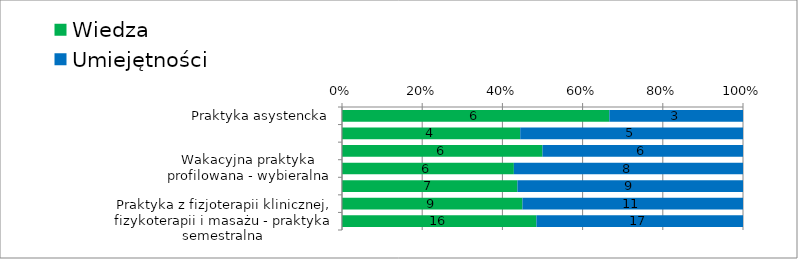
| Category | Wiedza | Umiejętności |
|---|---|---|
| Praktyka asystencka | 6 | 3 |
| Wakacyjna praktyka z kinezyterapii | 4 | 5 |
| Praktyka z fizjoterapii klinicznej, fizykoterapii i masażu | 6 | 6 |
| Wakacyjna praktyka profilowana - wybieralna | 6 | 8 |
| Praktyka z fizjoterapii klinicznej, fizykoterapii i masażu | 7 | 9 |
| Wakacyjna praktyka profilowana - wybieralna | 9 | 11 |
| Praktyka z fizjoterapii klinicznej, fizykoterapii i masażu - praktyka semestralna | 16 | 17 |